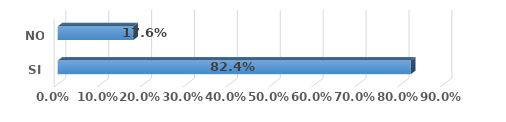
| Category | Series 0 |
|---|---|
| SI | 0.824 |
| NO | 0.176 |